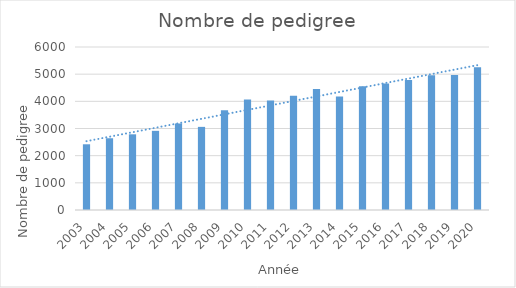
| Category | Series 0 |
|---|---|
| 2003.0 | 2419 |
| 2004.0 | 2641 |
| 2005.0 | 2786 |
| 2006.0 | 2914 |
| 2007.0 | 3180 |
| 2008.0 | 3060 |
| 2009.0 | 3669 |
| 2010.0 | 4068 |
| 2011.0 | 4031 |
| 2012.0 | 4208 |
| 2013.0 | 4450 |
| 2014.0 | 4178 |
| 2015.0 | 4559 |
| 2016.0 | 4661 |
| 2017.0 | 4782 |
| 2018.0 | 4962 |
| 2019.0 | 4967 |
| 2020.0 | 5253 |